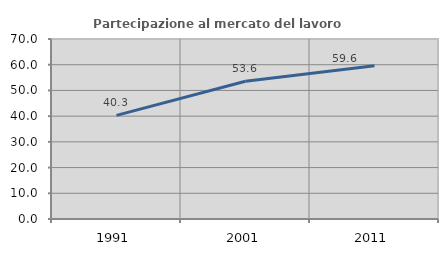
| Category | Partecipazione al mercato del lavoro  femminile |
|---|---|
| 1991.0 | 40.279 |
| 2001.0 | 53.551 |
| 2011.0 | 59.574 |